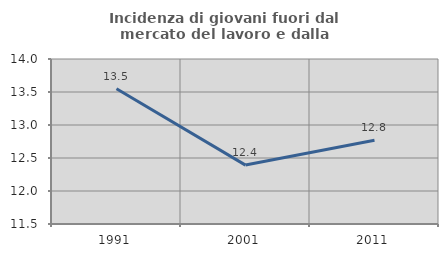
| Category | Incidenza di giovani fuori dal mercato del lavoro e dalla formazione  |
|---|---|
| 1991.0 | 13.55 |
| 2001.0 | 12.393 |
| 2011.0 | 12.769 |